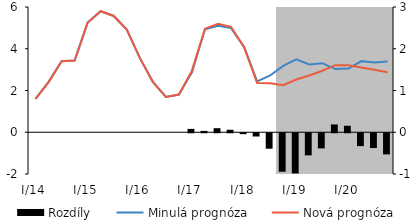
| Category | Rozdíly |
|---|---|
| I/14 | 0 |
| II | 0 |
| III | 0 |
| IV | 0 |
| I/15 | 0 |
| II | 0 |
| III | 0 |
| IV | 0 |
| I/16 | 0 |
| II | 0 |
| III | 0 |
| IV | 0 |
| I/17 | 0.08 |
| II | 0.032 |
| III | 0.097 |
| IV | 0.06 |
| I/18 | -0.021 |
| II | -0.078 |
| III | -0.37 |
| IV | -0.923 |
| I/19 | -0.963 |
| II | -0.53 |
| III | -0.363 |
| IV | 0.186 |
| I/20 | 0.156 |
| II | -0.308 |
| III | -0.354 |
| IV | -0.507 |